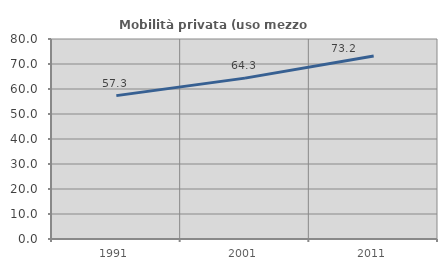
| Category | Mobilità privata (uso mezzo privato) |
|---|---|
| 1991.0 | 57.347 |
| 2001.0 | 64.347 |
| 2011.0 | 73.229 |